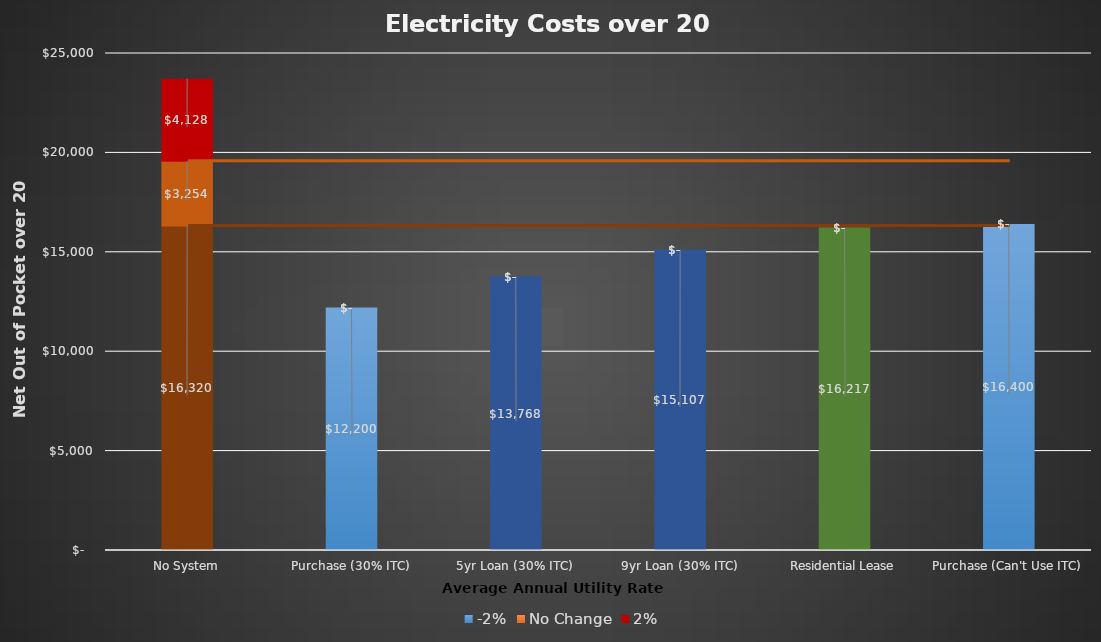
| Category | -2% | No Change | 2% |
|---|---|---|---|
| No System | 16320 | 3254 | 4128 |
| Purchase (30% ITC) | 12200 | 0 | 0 |
| 5yr Loan (30% ITC) | 13768 | 0 | 0 |
| 9yr Loan (30% ITC) | 15107 | 0 | 0 |
| Residential Lease | 16217 | 0 | 0 |
| Purchase (Can't Use ITC) | 16400 | 0 | 0 |